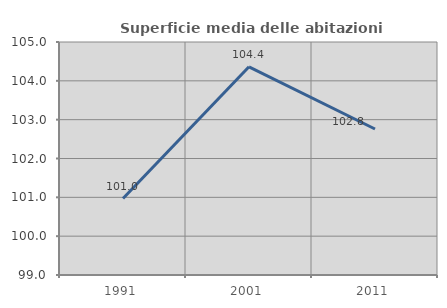
| Category | Superficie media delle abitazioni occupate |
|---|---|
| 1991.0 | 100.968 |
| 2001.0 | 104.361 |
| 2011.0 | 102.759 |